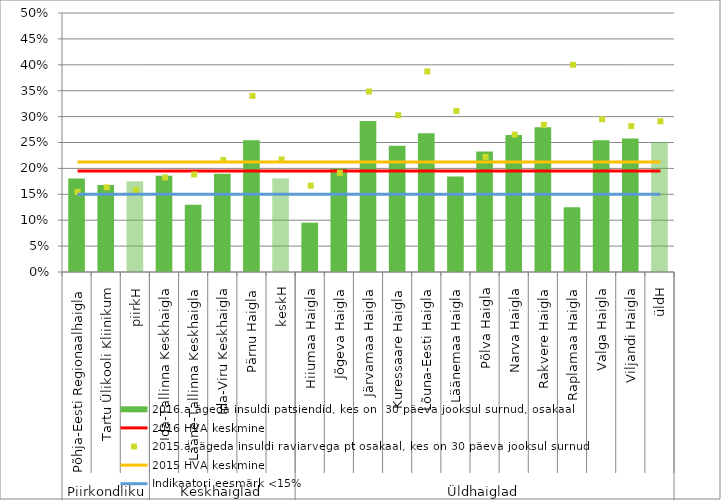
| Category | 2016.a ägeda insuldi patsiendid, kes on  30 päeva jooksul surnud, osakaal |
|---|---|
| 0 | 0.18 |
| 1 | 0.168 |
| 2 | 0.175 |
| 3 | 0.186 |
| 4 | 0.13 |
| 5 | 0.19 |
| 6 | 0.255 |
| 7 | 0.18 |
| 8 | 0.095 |
| 9 | 0.2 |
| 10 | 0.292 |
| 11 | 0.244 |
| 12 | 0.268 |
| 13 | 0.184 |
| 14 | 0.233 |
| 15 | 0.264 |
| 16 | 0.28 |
| 17 | 0.125 |
| 18 | 0.254 |
| 19 | 0.258 |
| 20 | 0.251 |